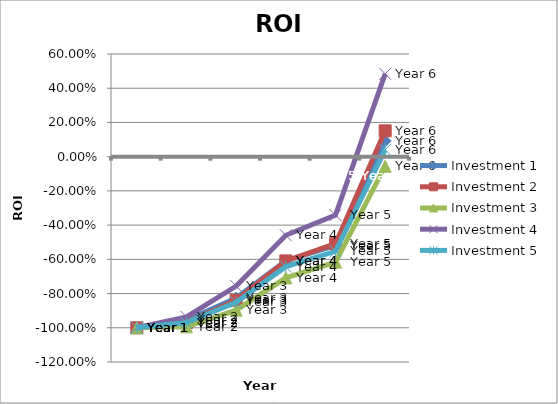
| Category | Investment 1 | Investment 2 | Investment 3 | Investment 4 | Investment 5 |
|---|---|---|---|---|---|
| Year 1 | -1 | -1 | -1 | -1 | -1 |
| Year 2 | -0.957 | -0.97 | -0.994 | -0.936 | -0.97 |
| Year 3 | -0.826 | -0.84 | -0.897 | -0.756 | -0.851 |
| Year 4 | -0.608 | -0.609 | -0.708 | -0.46 | -0.643 |
|  Year 5 | -0.519 | -0.509 | -0.616 | -0.342 | -0.553 |
| Year 6 | 0.091 | 0.151 | -0.056 | 0.484 | 0.04 |